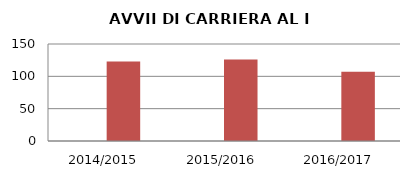
| Category | ANNO | NUMERO |
|---|---|---|
| 2014/2015 | 0 | 123 |
| 2015/2016 | 0 | 126 |
| 2016/2017 | 0 | 107 |